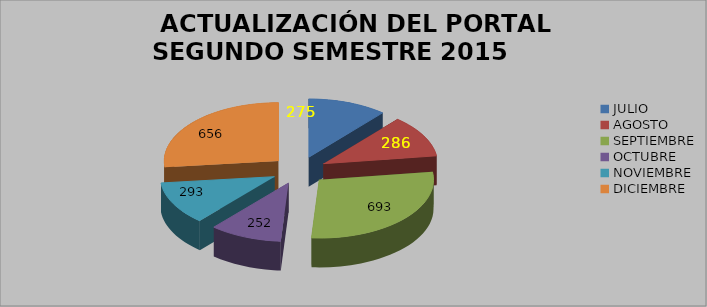
| Category |  ACTUALIZACIÓN DEL PORTAL SEGUNDO SEMESTRE 2015 |
|---|---|
| JULIO | 275 |
| AGOSTO | 286 |
| SEPTIEMBRE | 693 |
| OCTUBRE | 252 |
| NOVIEMBRE | 293 |
| DICIEMBRE | 656 |